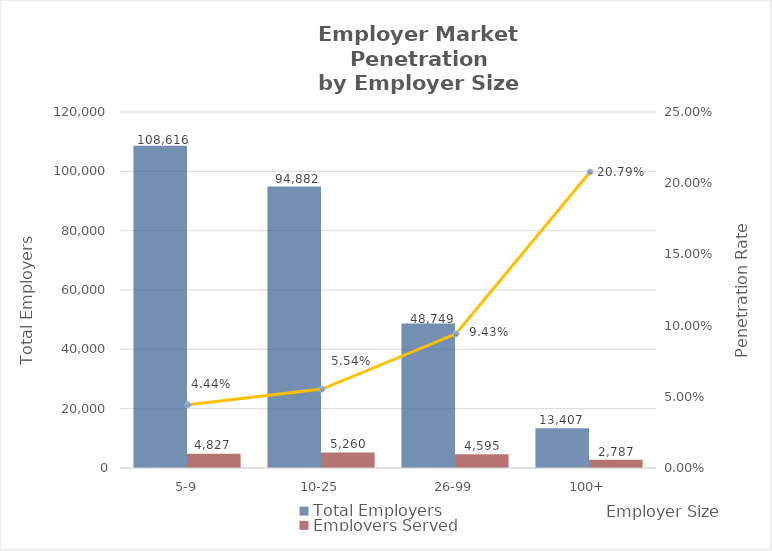
| Category | Total Employers | Employers Served |
|---|---|---|
| 5-9 | 108616 | 4827 |
| 10-25 | 94882 | 5260 |
| 26-99 | 48749 | 4595 |
| 100+ | 13407 | 2787 |